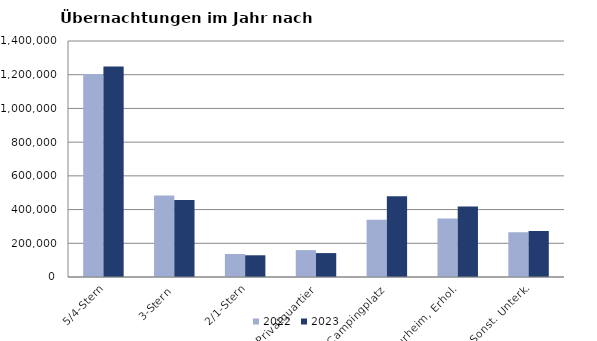
| Category | 2022 | 2023 |
|---|---|---|
| 5/4-Stern | 1204525 | 1248675 |
| 3-Stern | 483947 | 456951 |
| 2/1-Stern | 136375 | 128867 |
| Privatquartier | 159486 | 141840 |
| Campingplatz | 339296 | 478539 |
| Kurheim, Erhol. | 346691 | 418307 |
| Sonst. Unterk. | 265133 | 273065 |